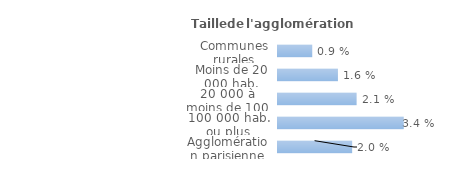
| Category | Series 0 |
|---|---|
| Communes rurales | 0.009 |
| Moins de 20 000 hab. | 0.016 |
| 20 000 à moins de 100 000 hab. | 0.021 |
| 100 000 hab. ou plus | 0.034 |
| Agglomération parisienne | 0.02 |